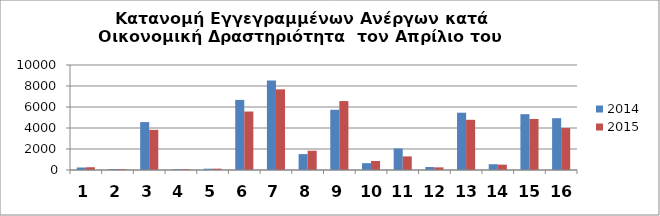
| Category | 2014 | 2015 |
|---|---|---|
| 0 | 238 | 264 |
| 1 | 95 | 74 |
| 2 | 4564 | 3823 |
| 3 | 59 | 68 |
| 4 | 124 | 128 |
| 5 | 6677 | 5568 |
| 6 | 8513 | 7679 |
| 7 | 1515 | 1836 |
| 8 | 5735 | 6566 |
| 9 | 650 | 855 |
| 10 | 2051 | 1296 |
| 11 | 283 | 250 |
| 12 | 5456 | 4780 |
| 13 | 550 | 508 |
| 14 | 5314 | 4861 |
| 15 | 4934 | 3995 |